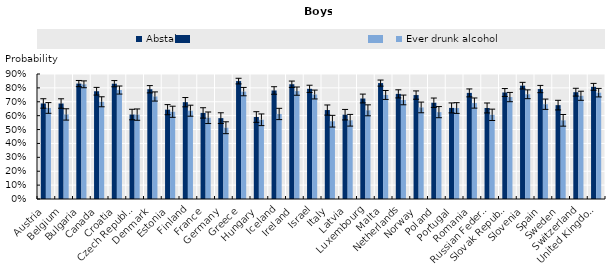
| Category | Abstainer | Ever drunk alcohol |
|---|---|---|
| Austria | 0.688 | 0.656 |
| Belgium | 0.687 | 0.609 |
| Bulgaria | 0.831 | 0.826 |
| Canada | 0.776 | 0.7 |
| Croatia | 0.83 | 0.784 |
| Czech Republic | 0.608 | 0.608 |
| Denmark | 0.79 | 0.738 |
| Estonia | 0.643 | 0.628 |
| Finland | 0.697 | 0.636 |
| France | 0.62 | 0.585 |
| Germany | 0.582 | 0.513 |
| Greece | 0.849 | 0.773 |
| Hungary | 0.59 | 0.57 |
| Iceland | 0.781 | 0.612 |
| Ireland | 0.826 | 0.777 |
| Israel | 0.793 | 0.752 |
| Italy | 0.64 | 0.56 |
| Latvia | 0.607 | 0.567 |
| Luxembourg | 0.724 | 0.638 |
| Malta | 0.835 | 0.749 |
| Netherlands | 0.757 | 0.713 |
| Norway | 0.748 | 0.659 |
| Poland | 0.693 | 0.625 |
| Portugal | 0.656 | 0.655 |
| Romania | 0.764 | 0.691 |
| Russian Federation | 0.655 | 0.606 |
| Slovak Republic | 0.767 | 0.734 |
| Slovenia | 0.816 | 0.754 |
| Spain | 0.792 | 0.682 |
| Sweden | 0.676 | 0.566 |
| Switzerland | 0.769 | 0.743 |
| United Kingdom | 0.808 | 0.766 |